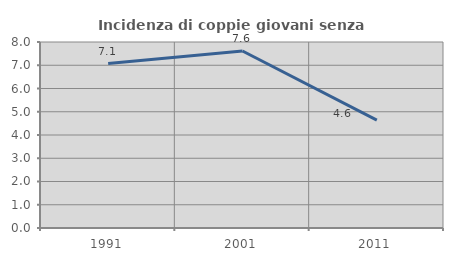
| Category | Incidenza di coppie giovani senza figli |
|---|---|
| 1991.0 | 7.071 |
| 2001.0 | 7.611 |
| 2011.0 | 4.64 |